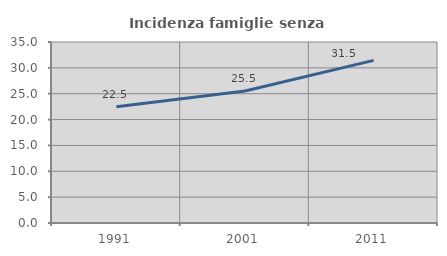
| Category | Incidenza famiglie senza nuclei |
|---|---|
| 1991.0 | 22.467 |
| 2001.0 | 25.511 |
| 2011.0 | 31.452 |